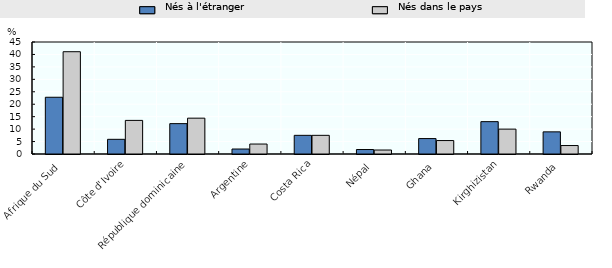
| Category | Nés à l'étranger | Nés dans le pays |
|---|---|---|
| Afrique du Sud | 22.8 | 41.1 |
| Côte d'Ivoire | 5.9 | 13.5 |
| République dominicaine | 12.2 | 14.4 |
| Argentine | 2 | 4 |
| Costa Rica | 7.5 | 7.5 |
| Népal | 1.8 | 1.6 |
| Ghana | 6.2 | 5.4 |
| Kirghizistan | 13 | 10 |
| Rwanda | 8.9 | 3.4 |